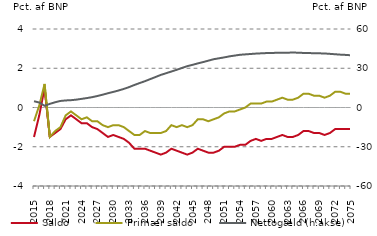
| Category | nul-linje | Saldo | Primær saldo |
|---|---|---|---|
| 2015.0 | 0 | -1.5 | -0.7 |
| 2016.0 | 0 | -0.4 | 0.1 |
| 2017.0 | 0 | 1 | 1.2 |
| 2018.0 | 0 | -1.5 | -1.5 |
| 2019.0 | 0 | -1.3 | -1.2 |
| 2020.0 | 0 | -1.1 | -1 |
| 2021.0 | 0 | -0.6 | -0.4 |
| 2022.0 | 0 | -0.4 | -0.2 |
| 2023.0 | 0 | -0.6 | -0.4 |
| 2024.0 | 0 | -0.8 | -0.6 |
| 2025.0 | 0 | -0.8 | -0.5 |
| 2026.0 | 0 | -1 | -0.7 |
| 2027.0 | 0 | -1.1 | -0.7 |
| 2028.0 | 0 | -1.3 | -0.9 |
| 2029.0 | 0 | -1.5 | -1 |
| 2030.0 | 0 | -1.4 | -0.9 |
| 2031.0 | 0 | -1.5 | -0.9 |
| 2032.0 | 0 | -1.6 | -1 |
| 2033.0 | 0 | -1.8 | -1.2 |
| 2034.0 | 0 | -2.1 | -1.4 |
| 2035.0 | 0 | -2.1 | -1.4 |
| 2036.0 | 0 | -2.1 | -1.2 |
| 2037.0 | 0 | -2.2 | -1.3 |
| 2038.0 | 0 | -2.3 | -1.3 |
| 2039.0 | 0 | -2.4 | -1.3 |
| 2040.0 | 0 | -2.3 | -1.2 |
| 2041.0 | 0 | -2.1 | -0.9 |
| 2042.0 | 0 | -2.2 | -1 |
| 2043.0 | 0 | -2.3 | -0.9 |
| 2044.0 | 0 | -2.4 | -1 |
| 2045.0 | 0 | -2.3 | -0.9 |
| 2046.0 | 0 | -2.1 | -0.6 |
| 2047.0 | 0 | -2.2 | -0.6 |
| 2048.0 | 0 | -2.3 | -0.7 |
| 2049.0 | 0 | -2.3 | -0.6 |
| 2050.0 | 0 | -2.2 | -0.5 |
| 2051.0 | 0 | -2 | -0.3 |
| 2052.0 | 0 | -2 | -0.2 |
| 2053.0 | 0 | -2 | -0.2 |
| 2054.0 | 0 | -1.9 | -0.1 |
| 2055.0 | 0 | -1.9 | 0 |
| 2056.0 | 0 | -1.7 | 0.2 |
| 2057.0 | 0 | -1.6 | 0.2 |
| 2058.0 | 0 | -1.7 | 0.2 |
| 2059.0 | 0 | -1.6 | 0.3 |
| 2060.0 | 0 | -1.6 | 0.3 |
| 2061.0 | 0 | -1.5 | 0.4 |
| 2062.0 | 0 | -1.4 | 0.5 |
| 2063.0 | 0 | -1.5 | 0.4 |
| 2064.0 | 0 | -1.5 | 0.4 |
| 2065.0 | 0 | -1.4 | 0.5 |
| 2066.0 | 0 | -1.2 | 0.7 |
| 2067.0 | 0 | -1.2 | 0.7 |
| 2068.0 | 0 | -1.3 | 0.6 |
| 2069.0 | 0 | -1.3 | 0.6 |
| 2070.0 | 0 | -1.4 | 0.5 |
| 2071.0 | 0 | -1.3 | 0.6 |
| 2072.0 | 0 | -1.1 | 0.8 |
| 2073.0 | 0 | -1.1 | 0.8 |
| 2074.0 | 0 | -1.1 | 0.7 |
| 2075.0 | 0 | -1.1 | 0.7 |